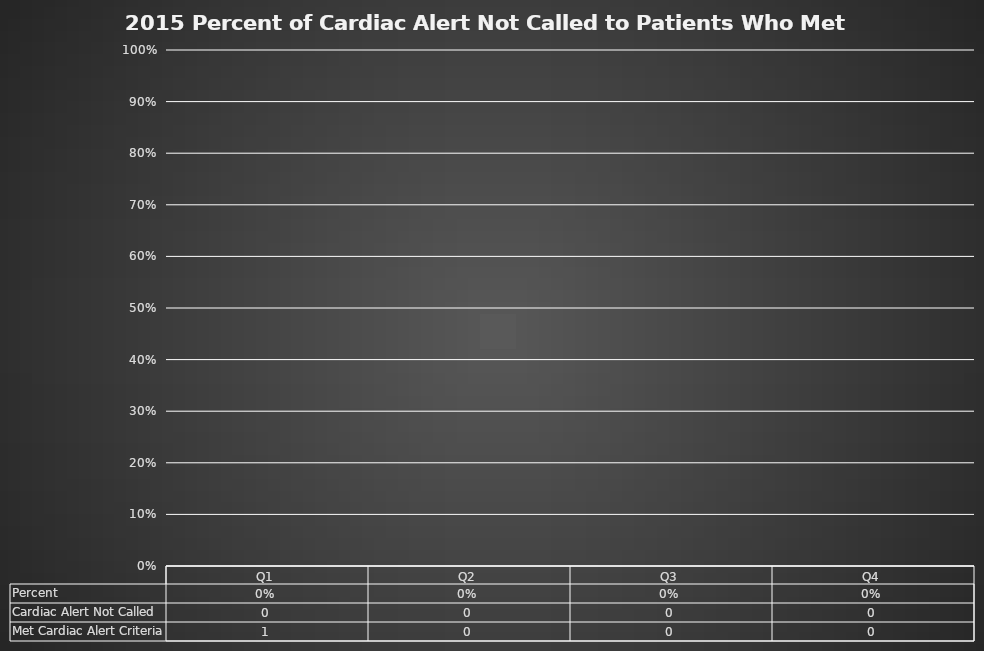
| Category | Percent |
|---|---|
| Q1 | 0 |
| Q2 | 0 |
| Q3 | 0 |
| Q4 | 0 |